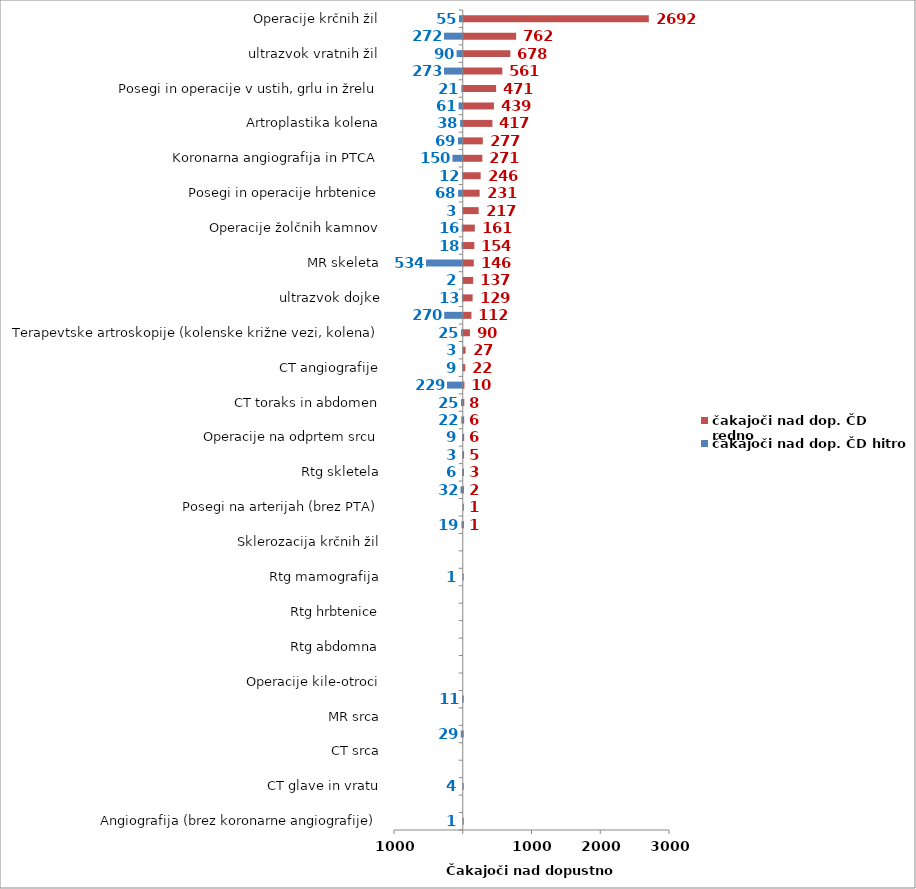
| Category | čakajoči nad dop. ČD hitro | čakajoči nad dop. ČD redno |
|---|---|---|
| Angiografija (brez koronarne angiografije) | -1 | 0 |
| Artroplastika gležnja | 0 | 0 |
| CT glave in vratu | -4 | 0 |
| CT skeleta | 0 | 0 |
| CT srca | 0 | 0 |
| Elektroencefalografija (EEG) | -29 | 0 |
| MR srca | 0 | 0 |
| MR toraks in abdomen | -11 | 0 |
| Operacije kile-otroci | 0 | 0 |
| PTA (perkutana transluminalna angioplastika) | 0 | 0 |
| Rtg abdomna | 0 | 0 |
| Rtg glave | 0 | 0 |
| Rtg hrbtenice | 0 | 0 |
| Rtg ledvic in sečnega mehurja | 0 | 0 |
| Rtg mamografija | -1 | 0 |
| Rtg PC | 0 | 0 |
| Sklerozacija krčnih žil | 0 | 0 |
| MR angiografije | -19 | 1 |
| Posegi na arterijah (brez PTA) | 0 | 1 |
| ultrazvok mehkih tkiv (mišica, tetiva, sklep, skrotum, vrat, kolki novorojenčki) | -32 | 2 |
| Rtg skletela | -6 | 3 |
| Operacija ščitnice (tudi obščitnice) | -3 | 5 |
| Operacije na odprtem srcu | -9 | 6 |
| ultrazvok rame | -22 | 6 |
| CT toraks in abdomen | -25 | 8 |
| Operacija karpalnega kanala | -229 | 10 |
| CT angiografije | -9 | 22 |
| Posegi na ušesu in mastoidu | -3 | 27 |
| Terapevtske artroskopije (kolenske križne vezi, kolena) | -25 | 90 |
| MR glave in vratu | -270 | 112 |
| ultrazvok dojke | -13 | 129 |
| Posegi in operacije nosu in obnosnih votlin | -2 | 137 |
| MR skeleta | -534 | 146 |
| Ortopedska operacija rame (samo terapevstki posegi na rami) | -18 | 154 |
| Operacije žolčnih kamnov | -16 | 161 |
| Operacija sive mrene (katarakta) | -3 | 217 |
| Posegi in operacije hrbtenice | -68 | 231 |
| Drugi posegi na perifernem ožilju | -12 | 246 |
| Koronarna angiografija in PTCA | -150 | 271 |
| Artroplastika kolka (protetika, endoproteza) | -69 | 277 |
| Artroplastika kolena | -38 | 417 |
| Operacije kile-odrasli | -61 | 439 |
| Posegi in operacije v ustih, grlu in žrelu | -21 | 471 |
| Elektromiografija (EMG) | -273 | 561 |
| ultrazvok vratnih žil | -90 | 678 |
| ultrazvok srca | -272 | 762 |
| Operacije krčnih žil | -55 | 2692 |